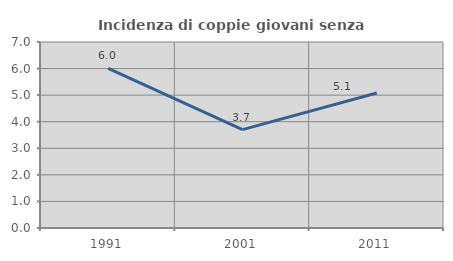
| Category | Incidenza di coppie giovani senza figli |
|---|---|
| 1991.0 | 6.009 |
| 2001.0 | 3.704 |
| 2011.0 | 5.079 |